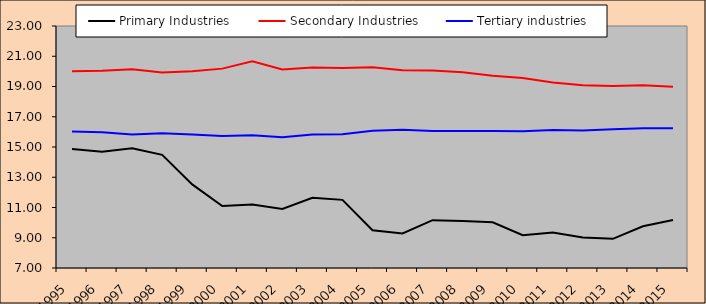
| Category | Primary Industries | Secondary Industries | Tertiary industries |
|---|---|---|---|
| 1995.0 | 14.864 | 20.004 | 16.017 |
| 1996.0 | 14.691 | 20.044 | 15.983 |
| 1997.0 | 14.912 | 20.142 | 15.83 |
| 1998.0 | 14.484 | 19.92 | 15.909 |
| 1999.0 | 12.529 | 20.014 | 15.834 |
| 2000.0 | 11.094 | 20.181 | 15.73 |
| 2001.0 | 11.191 | 20.674 | 15.784 |
| 2002.0 | 10.909 | 20.131 | 15.637 |
| 2003.0 | 11.648 | 20.257 | 15.821 |
| 2004.0 | 11.506 | 20.219 | 15.846 |
| 2005.0 | 9.5 | 20.272 | 16.073 |
| 2006.0 | 9.289 | 20.075 | 16.141 |
| 2007.0 | 10.162 | 20.056 | 16.052 |
| 2008.0 | 10.109 | 19.934 | 16.063 |
| 2009.0 | 10.022 | 19.718 | 16.05 |
| 2010.0 | 9.169 | 19.562 | 16.043 |
| 2011.0 | 9.348 | 19.258 | 16.131 |
| 2012.0 | 9.017 | 19.087 | 16.088 |
| 2013.0 | 8.929 | 19.037 | 16.175 |
| 2014.0 | 9.759 | 19.082 | 16.233 |
| 2015.0 | 10.175 | 18.989 | 16.237 |